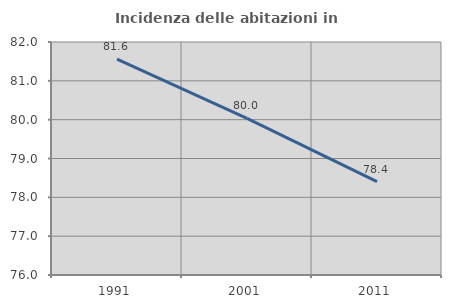
| Category | Incidenza delle abitazioni in proprietà  |
|---|---|
| 1991.0 | 81.561 |
| 2001.0 | 80.032 |
| 2011.0 | 78.402 |